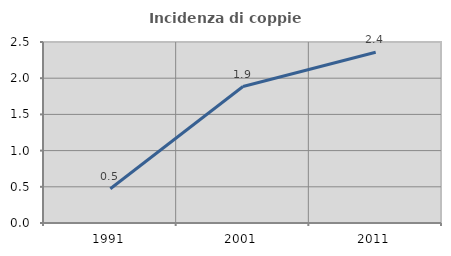
| Category | Incidenza di coppie miste |
|---|---|
| 1991.0 | 0.473 |
| 2001.0 | 1.885 |
| 2011.0 | 2.359 |